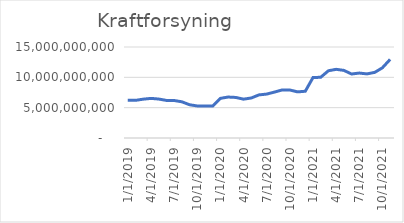
| Category | Kraftforsyning |
|---|---|
| 1/1/19 | 6223983833.333 |
| 2/1/19 | 6206158833.333 |
| 3/1/19 | 6403028833.333 |
| 4/1/19 | 6529173833.333 |
| 5/1/19 | 6422163833.333 |
| 6/1/19 | 6193669750 |
| 7/1/19 | 6178057250 |
| 8/1/19 | 5966233333.333 |
| 9/1/19 | 5480045833.333 |
| 10/1/19 | 5281421750 |
| 11/1/19 | 5278392583.333 |
| 12/1/19 | 5276923416.667 |
| 1/1/20 | 6534866333.333 |
| 2/1/20 | 6750795500 |
| 3/1/20 | 6684063416.667 |
| 4/1/20 | 6402310083.333 |
| 5/1/20 | 6595770083.333 |
| 6/1/20 | 7106295416.667 |
| 7/1/20 | 7239979583.333 |
| 8/1/20 | 7567724583.333 |
| 9/1/20 | 7920370000 |
| 10/1/20 | 7912532500 |
| 11/1/20 | 7603446666.667 |
| 12/1/20 | 7705595000 |
| 1/1/21 | 9958082916.667 |
| 2/1/21 | 10013620416.667 |
| 3/1/21 | 11086231666.667 |
| 4/1/21 | 11319970833.333 |
| 5/1/21 | 11146216666.667 |
| 6/1/21 | 10547711250 |
| 7/1/21 | 10704439583.333 |
| 8/1/21 | 10565898750 |
| 9/1/21 | 10816220833.333 |
| 10/1/21 | 11579531250 |
| 11/1/21 | 12955012916.667 |